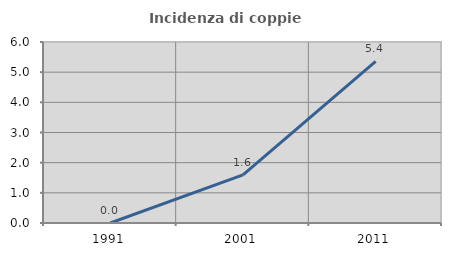
| Category | Incidenza di coppie miste |
|---|---|
| 1991.0 | 0 |
| 2001.0 | 1.596 |
| 2011.0 | 5.357 |